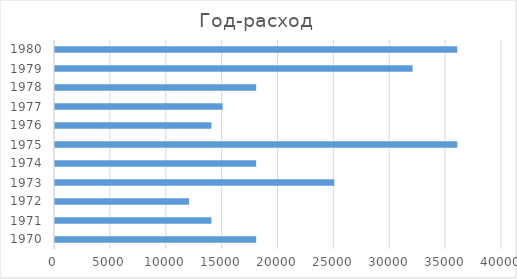
| Category | Расход |
|---|---|
| 1970.0 | 18000 |
| 1971.0 | 14000 |
| 1972.0 | 12000 |
| 1973.0 | 25000 |
| 1974.0 | 18000 |
| 1975.0 | 36000 |
| 1976.0 | 14000 |
| 1977.0 | 15000 |
| 1978.0 | 18000 |
| 1979.0 | 32000 |
| 1980.0 | 36000 |